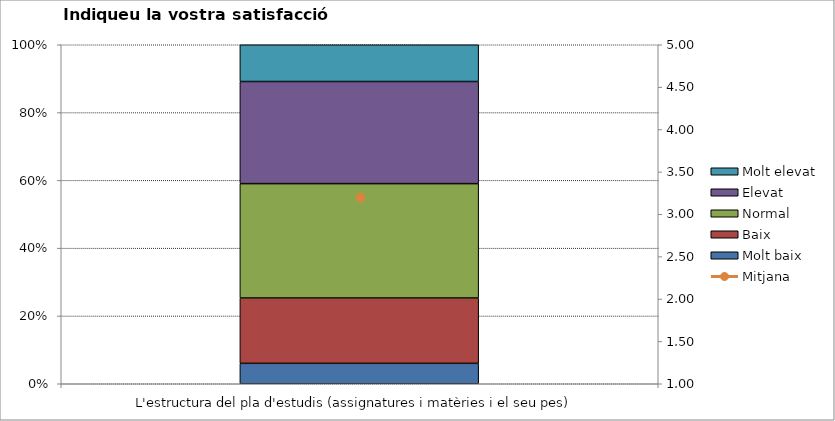
| Category | Molt baix | Baix | Normal  | Elevat | Molt elevat |
|---|---|---|---|---|---|
| L'estructura del pla d'estudis (assignatures i matèries i el seu pes) | 5 | 16 | 28 | 25 | 9 |